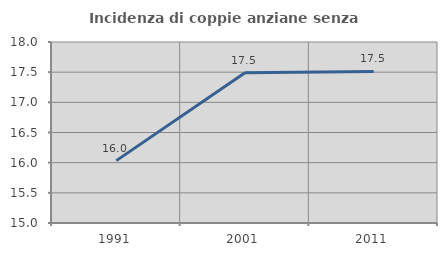
| Category | Incidenza di coppie anziane senza figli  |
|---|---|
| 1991.0 | 16.034 |
| 2001.0 | 17.489 |
| 2011.0 | 17.512 |